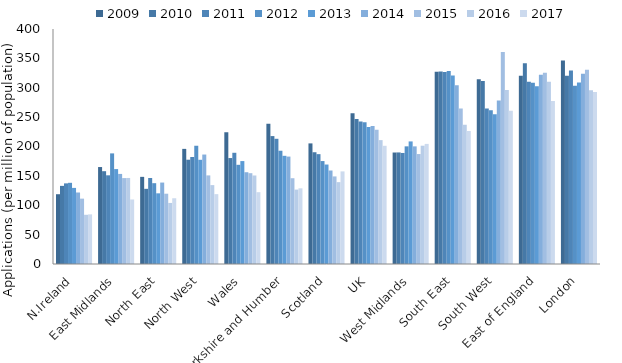
| Category | 2009 | 2010 | 2011 | 2012 | 2013 | 2014 | 2015 | 2016 | 2017 |
|---|---|---|---|---|---|---|---|---|---|
| N.Ireland | 118.775 | 132.979 | 137.243 | 138.188 | 129.529 | 121.706 | 111.255 | 83.776 | 84.456 |
| East Midlands | 165.038 | 157.973 | 150.968 | 188.274 | 161.574 | 153.319 | 146.235 | 146.443 | 109.814 |
| North East | 148.326 | 127.952 | 146.356 | 137.565 | 120.279 | 138.618 | 119.637 | 103.922 | 111.922 |
| North West | 195.958 | 177.495 | 182.115 | 201.284 | 177.377 | 186.317 | 150.797 | 134.275 | 118.893 |
| Wales | 224.423 | 180.328 | 189.307 | 168.83 | 175.188 | 156.21 | 154.561 | 150.649 | 122.232 |
| Yorkshire and Humber | 238.547 | 217.706 | 213.116 | 192.782 | 184.155 | 182.832 | 146.006 | 126.627 | 128.805 |
| Scotland | 205.279 | 190.225 | 186.985 | 175.211 | 169.304 | 159.137 | 149.079 | 139.323 | 157.609 |
| UK | 256.744 | 246.815 | 242.443 | 241.268 | 233.147 | 235.105 | 228.383 | 210.851 | 201.181 |
| West Midlands | 189.761 | 189.906 | 188.992 | 200.255 | 208.634 | 200.231 | 187.142 | 201.349 | 204.412 |
| South East | 327.056 | 327.59 | 326.831 | 328.371 | 320.816 | 304.372 | 264.71 | 236.98 | 226.522 |
| South West | 314.533 | 311.52 | 264.677 | 261.812 | 254.942 | 278.428 | 360.772 | 296.357 | 260.644 |
| East of England | 320.618 | 341.633 | 310.112 | 308.336 | 302.76 | 322.071 | 325.379 | 310.328 | 277.381 |
| London | 346.486 | 320.536 | 329.214 | 303.534 | 308.762 | 323.91 | 330.453 | 295.563 | 292.918 |